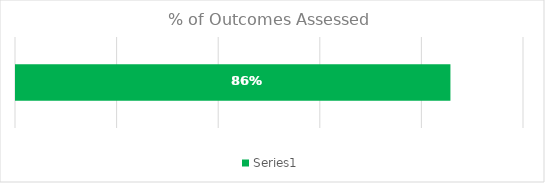
| Category | Series 0 |
|---|---|
| 0 | 0.857 |